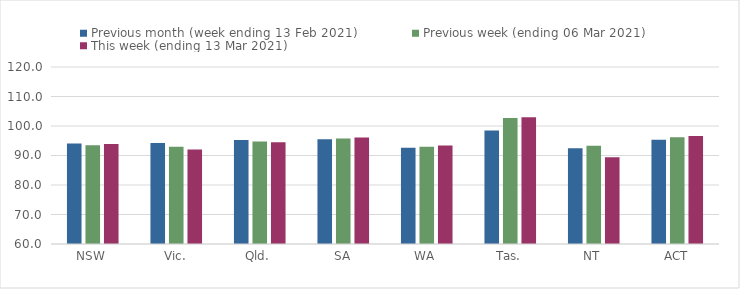
| Category | Previous month (week ending 13 Feb 2021) | Previous week (ending 06 Mar 2021) | This week (ending 13 Mar 2021) |
|---|---|---|---|
| NSW | 94.09 | 93.46 | 93.89 |
| Vic. | 94.22 | 92.96 | 92.04 |
| Qld. | 95.23 | 94.77 | 94.5 |
| SA | 95.5 | 95.73 | 96.09 |
| WA | 92.63 | 92.93 | 93.42 |
| Tas. | 98.44 | 102.72 | 102.99 |
| NT | 92.49 | 93.27 | 89.41 |
| ACT | 95.3 | 96.21 | 96.58 |